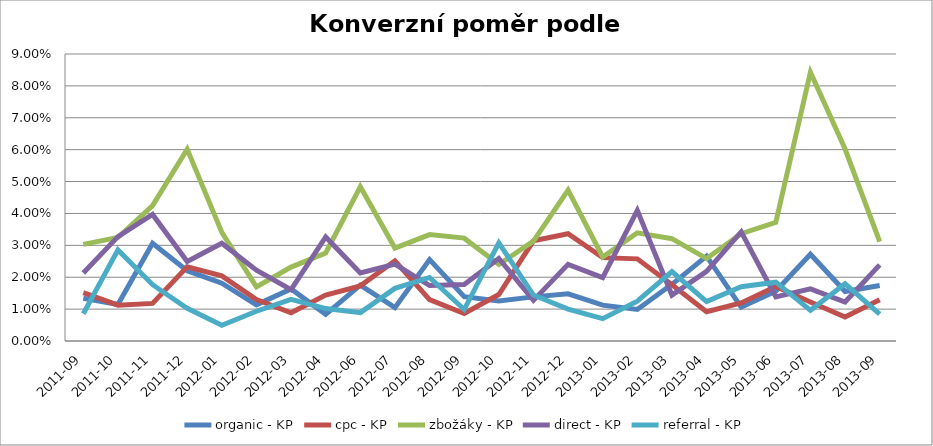
| Category | organic - KP | cpc - KP | zbožáky - KP | direct - KP | referral - KP |
|---|---|---|---|---|---|
| 2011-09 | 0.013 | 0.015 | 0.03 | 0.021 | 0.009 |
| 2011-10 | 0.011 | 0.011 | 0.032 | 0.033 | 0.029 |
| 2011-11 | 0.031 | 0.012 | 0.042 | 0.04 | 0.018 |
| 2011-12 | 0.022 | 0.023 | 0.06 | 0.025 | 0.01 |
| 2012-01 | 0.018 | 0.02 | 0.034 | 0.031 | 0.005 |
| 2012-02 | 0.011 | 0.013 | 0.017 | 0.022 | 0.009 |
| 2012-03 | 0.016 | 0.009 | 0.023 | 0.016 | 0.013 |
| 2012-04 | 0.008 | 0.014 | 0.028 | 0.033 | 0.01 |
| 2012-06 | 0.018 | 0.017 | 0.048 | 0.021 | 0.009 |
| 2012-07 | 0.01 | 0.025 | 0.029 | 0.024 | 0.017 |
| 2012-08 | 0.026 | 0.013 | 0.033 | 0.017 | 0.02 |
| 2012-09 | 0.014 | 0.009 | 0.032 | 0.018 | 0.01 |
| 2012-10 | 0.013 | 0.015 | 0.024 | 0.026 | 0.031 |
| 2012-11 | 0.014 | 0.031 | 0.031 | 0.013 | 0.014 |
| 2012-12 | 0.015 | 0.034 | 0.047 | 0.024 | 0.01 |
| 2013-01 | 0.011 | 0.026 | 0.026 | 0.02 | 0.007 |
| 2013-02 | 0.01 | 0.026 | 0.034 | 0.041 | 0.012 |
| 2013-03 | 0.018 | 0.018 | 0.032 | 0.014 | 0.022 |
| 2013-04 | 0.027 | 0.009 | 0.026 | 0.022 | 0.012 |
| 2013-05 | 0.011 | 0.012 | 0.034 | 0.034 | 0.017 |
| 2013-06 | 0.016 | 0.017 | 0.037 | 0.014 | 0.018 |
| 2013-07 | 0.027 | 0.012 | 0.084 | 0.016 | 0.01 |
| 2013-08 | 0.016 | 0.008 | 0.06 | 0.012 | 0.018 |
| 2013-09 | 0.017 | 0.013 | 0.031 | 0.024 | 0.008 |